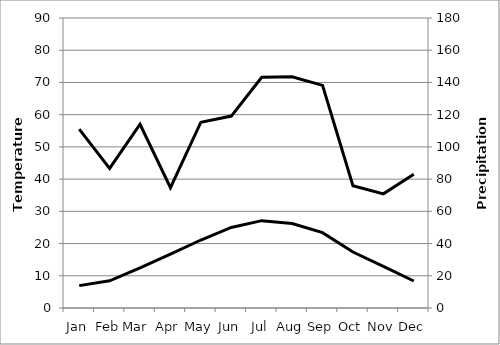
| Category | Series 0 |
|---|---|
| Jan | 6.94 |
| Feb | 8.44 |
| Mar  | 12.44 |
| Apr | 16.72 |
| May | 21.1 |
| Jun | 25 |
| Jul | 27.11 |
| Aug | 26.22 |
| Sep | 23.38 |
| Oct | 17.38 |
| Nov | 12.94 |
| Dec | 8.38 |